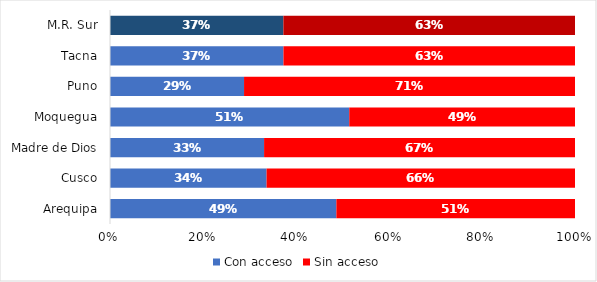
| Category | Con acceso | Sin acceso |
|---|---|---|
| Arequipa | 337.846 | 356.142 |
| Cusco | 243.106 | 478.869 |
| Madre de Dios | 26.932 | 54.342 |
| Moquegua | 53.476 | 50.456 |
| Puno | 219.578 | 542.122 |
| Tacna | 67.794 | 113.934 |
| M.R. Sur | 948.733 | 1595.865 |